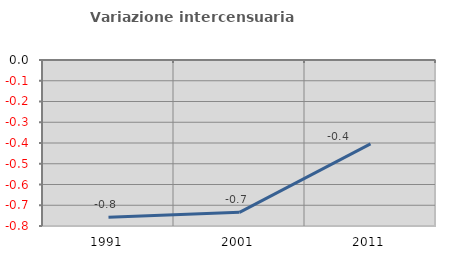
| Category | Variazione intercensuaria annua |
|---|---|
| 1991.0 | -0.758 |
| 2001.0 | -0.734 |
| 2011.0 | -0.404 |